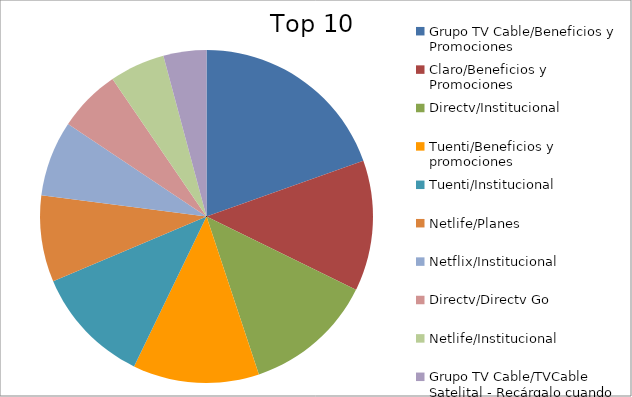
| Category | Series 0 |
|---|---|
| Grupo TV Cable/Beneficios y Promociones | 15.28 |
| Claro/Beneficios y Promociones | 9.93 |
| Directv/Institucional | 9.88 |
| Tuenti/Beneficios y promociones | 9.58 |
| Tuenti/Institucional | 8.96 |
| Netlife/Planes | 6.56 |
| Netflix/Institucional | 5.74 |
| Directv/Directv Go | 4.75 |
| Netlife/Institucional | 4.2 |
| Grupo TV Cable/TVCable Satelital - Recárgalo cuando quieras y donde quieras! | 3.26 |